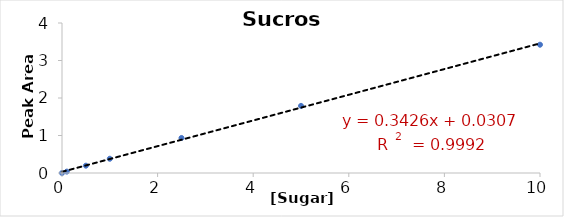
| Category | Series 0 |
|---|---|
| 0.0 | 0 |
| 0.1 | 0.037 |
| 0.5 | 0.195 |
| 1.0 | 0.38 |
| 2.5 | 0.934 |
| 5.0 | 1.79 |
| 10.0 | 3.421 |